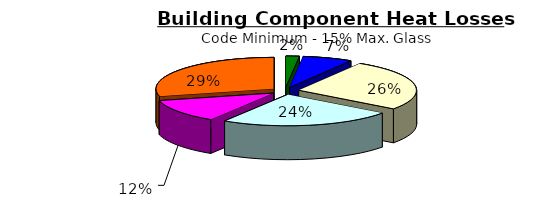
| Category | Series 0 |
|---|---|
| 0 | 508.008 |
| 1 | 1884.246 |
| 2 | 7269.15 |
| 3 | 6537.735 |
| 4 | 3338.528 |
| 5 | 7938.016 |